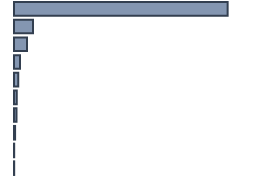
| Category | Percentatge |
|---|---|
| 0 | 89.015 |
| 1 | 7.955 |
| 2 | 5.379 |
| 3 | 2.5 |
| 4 | 1.818 |
| 5 | 1.136 |
| 6 | 1.061 |
| 7 | 0.455 |
| 8 | 0.076 |
| 9 | 0.076 |